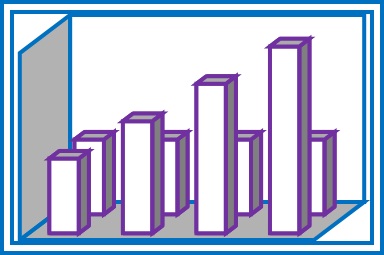
| Category | Series 1 | Series 2 |
|---|---|---|
| Point 1 | 10 | 10 |
| Point 2 | 15 | 10 |
| Point 3 | 20 | 10 |
| Point 4 | 25 | 10 |